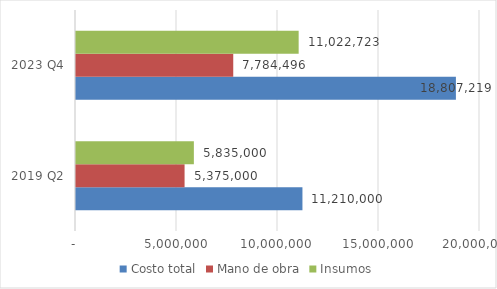
| Category | Costo total | Mano de obra | Insumos |
|---|---|---|---|
| 2019 Q2 | 11210000 | 5375000 | 5835000 |
| 2023 Q4 | 18807218.74 | 7784496 | 11022722.74 |